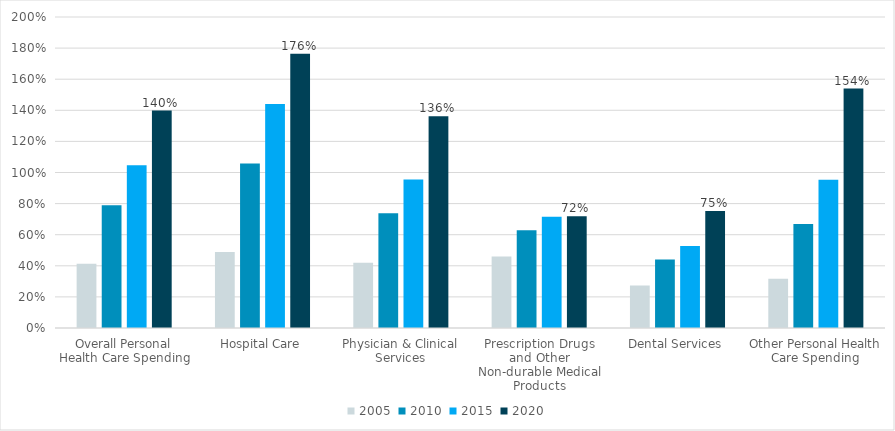
| Category | Series 1 | 2005 | Series 3 | Series 4 | 2010 | Series 6 | Series 7 | 2015 | Series 9 | Series 10 | 2020 |
|---|---|---|---|---|---|---|---|---|---|---|---|
| Overall Personal Health Care Spending |  | 0.414 |  |  | 0.789 |  |  | 1.046 |  |  | 1.398 |
| Hospital Care |  | 0.489 |  |  | 1.058 |  |  | 1.44 |  |  | 1.764 |
| Physician & Clinical Services |  | 0.42 |  |  | 0.738 |  |  | 0.955 |  |  | 1.362 |
| Prescription Drugs and Other Non-durable Medical Products |  | 0.46 |  |  | 0.629 |  |  | 0.716 |  |  | 0.718 |
| Dental Services |  | 0.274 |  |  | 0.44 |  |  | 0.527 |  |  | 0.753 |
| Other Personal Health Care Spending |  | 0.317 |  |  | 0.669 |  |  | 0.954 |  |  | 1.54 |